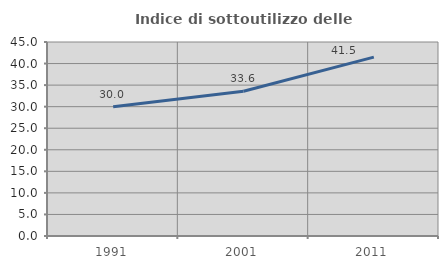
| Category | Indice di sottoutilizzo delle abitazioni  |
|---|---|
| 1991.0 | 30 |
| 2001.0 | 33.573 |
| 2011.0 | 41.485 |